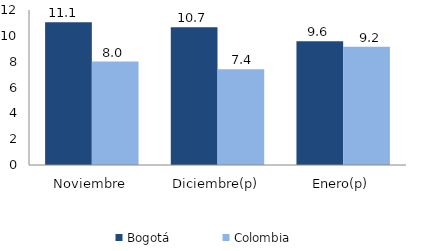
| Category | Bogotá | Colombia |
|---|---|---|
| Noviembre | 11.059 | 8.013 |
| Diciembre(p) | 10.67 | 7.418 |
| Enero(p) | 9.581 | 9.164 |